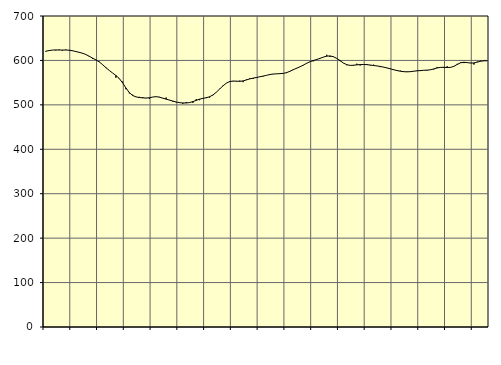
| Category | Piggar | Series 1 |
|---|---|---|
| nan | 619.7 | 620.73 |
| 87.0 | 622 | 622.19 |
| 87.0 | 623.1 | 623.29 |
| 87.0 | 622.6 | 623.64 |
| nan | 624.4 | 623.42 |
| 88.0 | 621.9 | 623.4 |
| 88.0 | 624.4 | 623.42 |
| 88.0 | 623.5 | 622.99 |
| nan | 621.2 | 621.82 |
| 89.0 | 621.1 | 620.06 |
| 89.0 | 618.9 | 618.25 |
| 89.0 | 615.7 | 616.25 |
| nan | 613.7 | 613.35 |
| 90.0 | 610.1 | 609.4 |
| 90.0 | 603.4 | 605.26 |
| 90.0 | 601.9 | 601.32 |
| nan | 597.5 | 596.67 |
| 91.0 | 590.2 | 590.57 |
| 91.0 | 582.8 | 583.75 |
| 91.0 | 577.6 | 577.49 |
| nan | 571.8 | 571.72 |
| 92.0 | 561.2 | 566.08 |
| 92.0 | 558.5 | 559.22 |
| 92.0 | 552.3 | 549.41 |
| nan | 535.1 | 537.87 |
| 93.0 | 525.8 | 527.65 |
| 93.0 | 522.8 | 521.03 |
| 93.0 | 517.8 | 517.9 |
| nan | 518.1 | 516.51 |
| 94.0 | 517.5 | 515.77 |
| 94.0 | 515 | 515.35 |
| 94.0 | 513.6 | 515.94 |
| nan | 517.7 | 517.61 |
| 95.0 | 518.2 | 518.44 |
| 95.0 | 517.9 | 517.31 |
| 95.0 | 514.7 | 515.1 |
| nan | 516.5 | 512.84 |
| 96.0 | 511.1 | 510.7 |
| 96.0 | 507.3 | 508.51 |
| 96.0 | 505.9 | 506.4 |
| nan | 505.5 | 504.96 |
| 97.0 | 502.5 | 504.31 |
| 97.0 | 506.3 | 504.22 |
| 97.0 | 505.6 | 505.11 |
| nan | 504.5 | 507.26 |
| 98.0 | 512.9 | 510.11 |
| 98.0 | 510.5 | 512.82 |
| 98.0 | 513.9 | 514.57 |
| nan | 517.4 | 515.97 |
| 99.0 | 516.4 | 518.27 |
| 99.0 | 521.7 | 522.31 |
| 99.0 | 528.7 | 528.45 |
| nan | 536.1 | 535.62 |
| 0.0 | 543.4 | 542.8 |
| 0.0 | 549 | 548.84 |
| 0.0 | 553.5 | 552.34 |
| nan | 553 | 553.6 |
| 1.0 | 552.7 | 553.36 |
| 1.0 | 554.5 | 552.91 |
| 1.0 | 551.1 | 553.88 |
| nan | 557.1 | 556.12 |
| 2.0 | 559.7 | 558.4 |
| 2.0 | 558.5 | 560.16 |
| 2.0 | 562.3 | 561.57 |
| nan | 563.5 | 563.15 |
| 3.0 | 564 | 564.79 |
| 3.0 | 566.4 | 566.49 |
| 3.0 | 569.2 | 568.23 |
| nan | 569.1 | 569.35 |
| 4.0 | 569.6 | 569.81 |
| 4.0 | 569.7 | 570.25 |
| 4.0 | 571.2 | 570.88 |
| nan | 571.5 | 572.53 |
| 5.0 | 576.1 | 575.57 |
| 5.0 | 580.2 | 579.14 |
| 5.0 | 581.8 | 582.49 |
| nan | 585.9 | 585.62 |
| 6.0 | 589 | 589.52 |
| 6.0 | 594 | 593.61 |
| 6.0 | 597.3 | 597.02 |
| nan | 598 | 599.76 |
| 7.0 | 603.1 | 602 |
| 7.0 | 605 | 604.65 |
| 7.0 | 607.3 | 607.48 |
| nan | 612.7 | 609.6 |
| 8.0 | 607.9 | 610.1 |
| 8.0 | 609 | 608.33 |
| 8.0 | 604.5 | 604.57 |
| nan | 598.3 | 599.48 |
| 9.0 | 593.8 | 594.14 |
| 9.0 | 589.2 | 590.41 |
| 9.0 | 589.1 | 588.85 |
| nan | 588.3 | 589.2 |
| 10.0 | 592.6 | 590.04 |
| 10.0 | 588.6 | 590.67 |
| 10.0 | 590.5 | 590.87 |
| nan | 591.9 | 590.52 |
| 11.0 | 588.7 | 589.64 |
| 11.0 | 590.4 | 588.52 |
| 11.0 | 587.4 | 587.61 |
| nan | 584.9 | 586.48 |
| 12.0 | 585.3 | 584.88 |
| 12.0 | 582.8 | 583.13 |
| 12.0 | 581.7 | 581.13 |
| nan | 580 | 579 |
| 13.0 | 576.2 | 577.2 |
| 13.0 | 577 | 575.68 |
| 13.0 | 575.6 | 574.67 |
| nan | 574.8 | 574.31 |
| 14.0 | 574.2 | 574.72 |
| 14.0 | 575.3 | 575.78 |
| 14.0 | 576.2 | 576.63 |
| nan | 576 | 577.23 |
| 15.0 | 578 | 577.72 |
| 15.0 | 577.2 | 578.12 |
| 15.0 | 578.7 | 578.93 |
| nan | 579.7 | 580.85 |
| 16.0 | 585.3 | 583.06 |
| 16.0 | 584.8 | 584.36 |
| 16.0 | 582.9 | 584.51 |
| nan | 586.9 | 584.03 |
| 17.0 | 583.9 | 584.35 |
| 17.0 | 586.2 | 586.73 |
| 17.0 | 592.3 | 590.91 |
| nan | 595.5 | 594.64 |
| 18.0 | 594 | 595.87 |
| 18.0 | 594.7 | 595.08 |
| 18.0 | 594.5 | 594.08 |
| nan | 590.7 | 594.34 |
| 19.0 | 597.2 | 596.17 |
| 19.0 | 599.4 | 598.17 |
| 19.0 | 599.9 | 599.15 |
| nan | 599.7 | 599.13 |